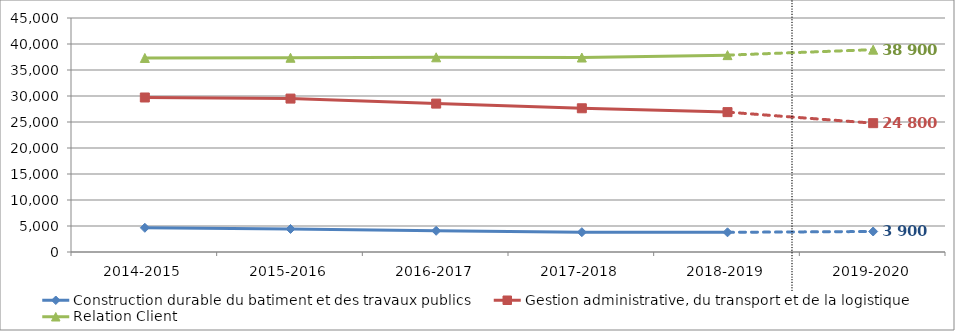
| Category | Construction durable du batiment et des travaux publics | Gestion administrative, du transport et de la logistique | Relation Client |
|---|---|---|---|
| 2014-2015 | 4656 | 29712 | 37314 |
| 2015-2016 | 4428 | 29504 | 37355 |
| 2016-2017 | 4077 | 28537 | 37442 |
| 2017-2018 | 3812 | 27639 | 37400 |
| 2018-2019 | 3788 | 26900 | 37858 |
| 2019-2020 | 3943 | 24775 | 38911 |